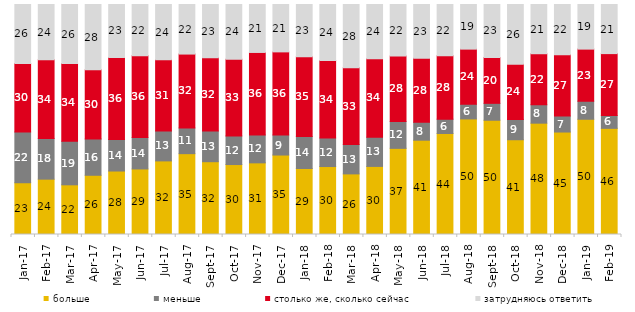
| Category | больше | меньше | столько же, сколько сейчас | затрудняюсь ответить |
|---|---|---|---|---|
| 2017-01-01 | 22.5 | 22.05 | 29.85 | 25.6 |
| 2017-02-01 | 24.05 | 17.7 | 34.2 | 24 |
| 2017-03-01 | 21.6 | 18.9 | 33.8 | 25.7 |
| 2017-04-01 | 25.75 | 15.8 | 30.05 | 28.4 |
| 2017-05-01 | 27.6 | 13.7 | 35.7 | 23 |
| 2017-06-01 | 28.5 | 13.65 | 35.6 | 22.25 |
| 2017-07-01 | 32 | 13 | 30.95 | 24.05 |
| 2017-08-01 | 35.15 | 11.2 | 32.1 | 21.55 |
| 2017-09-01 | 31.65 | 13.3 | 31.95 | 23.1 |
| 2017-10-01 | 30.4 | 12.45 | 33.35 | 23.75 |
| 2017-11-01 | 31.15 | 12.15 | 35.85 | 20.85 |
| 2017-12-01 | 34.55 | 8.7 | 36.15 | 20.6 |
| 2018-01-01 | 28.7 | 13.9 | 34.65 | 22.75 |
| 2018-02-01 | 29.55 | 12.4 | 33.7 | 24.35 |
| 2018-03-01 | 26.35 | 12.75 | 33.35 | 27.55 |
| 2018-04-01 | 29.6 | 12.7 | 34.1 | 23.6 |
| 2018-05-01 | 37.45 | 11.7 | 28.45 | 22.4 |
| 2018-06-01 | 41 | 7.8 | 27.85 | 23.35 |
| 2018-07-01 | 43.9 | 6.25 | 27.6 | 22.25 |
| 2018-08-01 | 50.25 | 6.35 | 24 | 19.4 |
| 2018-09-01 | 49.65 | 7.35 | 19.95 | 23 |
| 2018-10-01 | 41.2 | 8.85 | 23.95 | 26 |
| 2018-11-01 | 48.403 | 8.034 | 22.156 | 21.407 |
| 2018-12-01 | 44.55 | 6.95 | 26.7 | 21.8 |
| 2019-01-01 | 50.1 | 7.85 | 22.65 | 19.4 |
| 2019-02-01 | 46.15 | 5.6 | 26.9 | 21.35 |